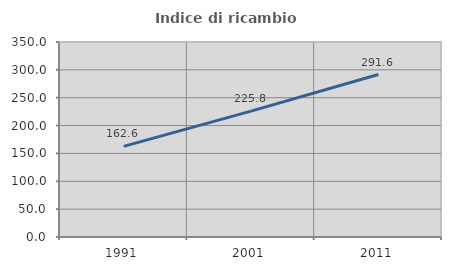
| Category | Indice di ricambio occupazionale  |
|---|---|
| 1991.0 | 162.588 |
| 2001.0 | 225.836 |
| 2011.0 | 291.566 |